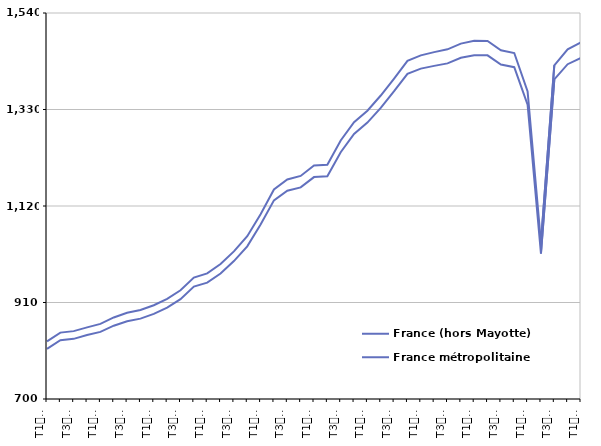
| Category | France (hors Mayotte) | France métropolitaine |
|---|---|---|
| T1
2011 | 825.3 | 809 |
| T2
2011 | 844.5 | 827.9 |
| T3
2011 | 847.7 | 830.9 |
| T4
2011 | 855.9 | 839.1 |
| T1
2012 | 863.4 | 846 |
| T2
2012 | 877.5 | 859.5 |
| T3
2012 | 887.5 | 869 |
| T4
2012 | 893.6 | 874.9 |
| T1
2013 | 904.1 | 885.3 |
| T2
2013 | 918 | 898.9 |
| T3
2013 | 936.5 | 917.3 |
| T4
2013 | 964.2 | 944.7 |
| T1
2014 | 973.4 | 953.1 |
| T2
2014 | 993.6 | 973 |
| T3
2014 | 1021.3 | 1000.1 |
| T4
2014 | 1054.3 | 1032.3 |
| T1
2015 | 1102.2 | 1079.8 |
| T2
2015 | 1155.9 | 1132.3 |
| T3
2015 | 1177.6 | 1153.3 |
| T4
2015 | 1185.4 | 1160.5 |
| T1
2016 | 1208 | 1182.9 |
| T2
2016 | 1209.8 | 1184.9 |
| T3
2016 | 1262.6 | 1237.1 |
| T4
2016 | 1302.4 | 1276.7 |
| T1
2017 | 1327.4 | 1301.5 |
| T2
2017 | 1360.4 | 1333.7 |
| T3
2017 | 1397.4 | 1369.8 |
| T4
2017 | 1436 | 1407.6 |
| T1
2018 | 1447.8 | 1419 |
| T2
2018 | 1454.9 | 1424.9 |
| T3
2018 | 1460.9 | 1430.4 |
| T4
2018 | 1473.4 | 1442.7 |
| T1
2019 | 1479.7 | 1447.8 |
| T2
2019 | 1479.3 | 1447.9 |
| T3
2019 | 1459 | 1428 |
| T4
2019 | 1452.9 | 1422.1 |
| T1
2020 | 1369.3 | 1340.5 |
| T2
2020 | 1040.4 | 1016.7 |
| T3
2020 | 1426.2 | 1395.7 |
| T4
2020 | 1461 | 1428.6 |
| T1
2021 | 1475.9 | 1442.5 |